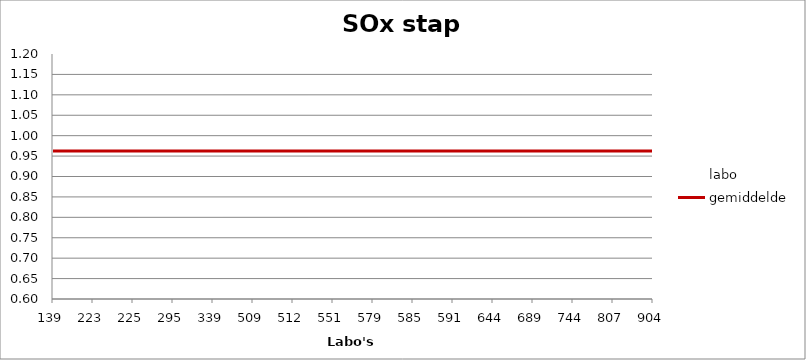
| Category | labo | gemiddelde |
|---|---|---|
| 139.0 | 1.015 | 0.962 |
| 223.0 | 0.976 | 0.962 |
| 225.0 | 0.995 | 0.962 |
| 295.0 | 0.949 | 0.962 |
| 339.0 | 0.967 | 0.962 |
| 509.0 | 1.006 | 0.962 |
| 512.0 | 0.952 | 0.962 |
| 551.0 | 0.942 | 0.962 |
| 579.0 | 0.922 | 0.962 |
| 585.0 | 0.72 | 0.962 |
| 591.0 | 1.015 | 0.962 |
| 644.0 | 1.026 | 0.962 |
| 689.0 | 0.97 | 0.962 |
| 744.0 | 0.926 | 0.962 |
| 807.0 | 0.893 | 0.962 |
| 904.0 | 0.949 | 0.962 |